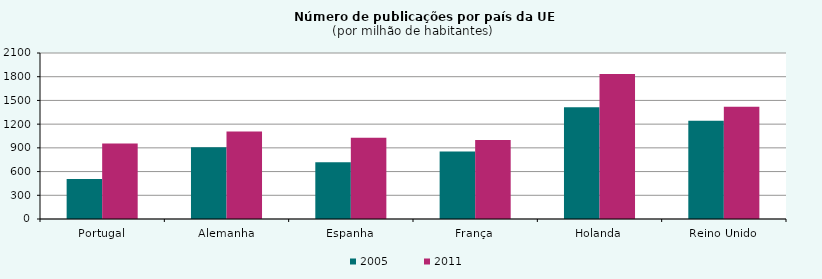
| Category | 2005 | 2011 |
|---|---|---|
| Portugal | 507.253 | 954.015 |
| Alemanha | 908.209 | 1106.608 |
| Espanha | 717.505 | 1026.652 |
| França | 854.493 | 999.686 |
| Holanda | 1413.447 | 1834.796 |
| Reino Unido | 1241.96 | 1418.768 |